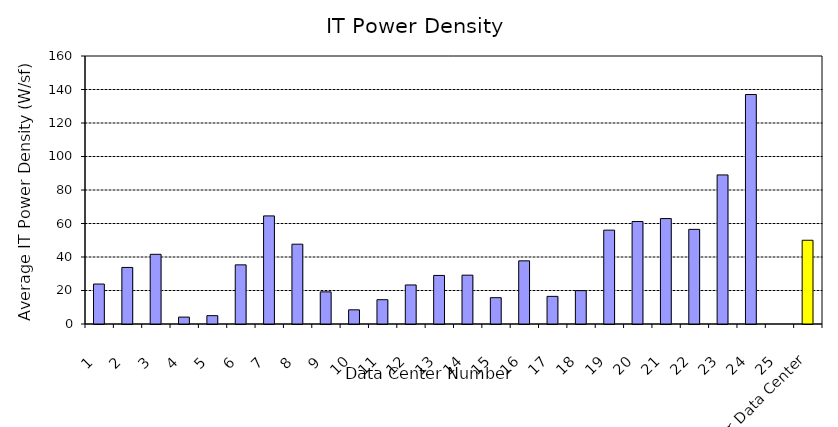
| Category | IT Power Density |
|---|---|
| 1 | 23.86 |
| 2 | 33.77 |
| 3 | 41.6 |
| 4 | 4.12 |
| 5 | 4.98 |
| 6 | 35.31 |
| 7 | 64.54 |
| 8 | 47.64 |
| 9 | 19.19 |
| 10 | 8.47 |
| 11 | 14.51 |
| 12 | 23.31 |
| 13 | 29 |
| 14 | 29.16 |
| 15 | 15.71 |
| 16 | 37.7 |
| 17 | 16.5 |
| 18 | 19.93 |
| 19 | 56.03 |
| 20 | 61.18 |
| 21 | 62.94 |
| 22 | 56.5 |
| 23 | 89 |
| 24 | 137 |
| 25 | 0 |
| Your Data Center | 50 |